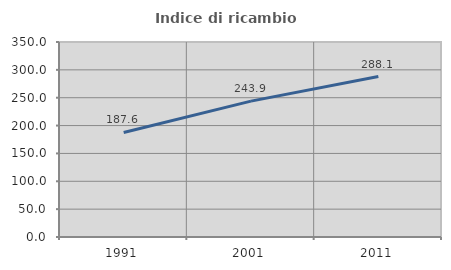
| Category | Indice di ricambio occupazionale  |
|---|---|
| 1991.0 | 187.626 |
| 2001.0 | 243.916 |
| 2011.0 | 288.068 |